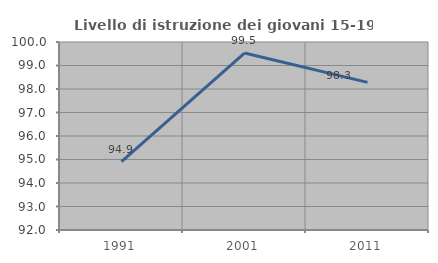
| Category | Livello di istruzione dei giovani 15-19 anni |
|---|---|
| 1991.0 | 94.909 |
| 2001.0 | 99.531 |
| 2011.0 | 98.283 |